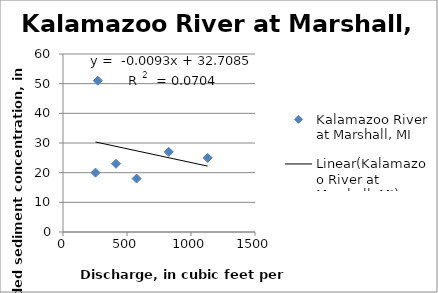
| Category | Kalamazoo River at Marshall, MI |
|---|---|
| 254.0 | 20 |
| 414.0 | 23 |
| 575.0 | 18 |
| 272.0 | 51 |
| 1130.0 | 25 |
| 826.0 | 27 |